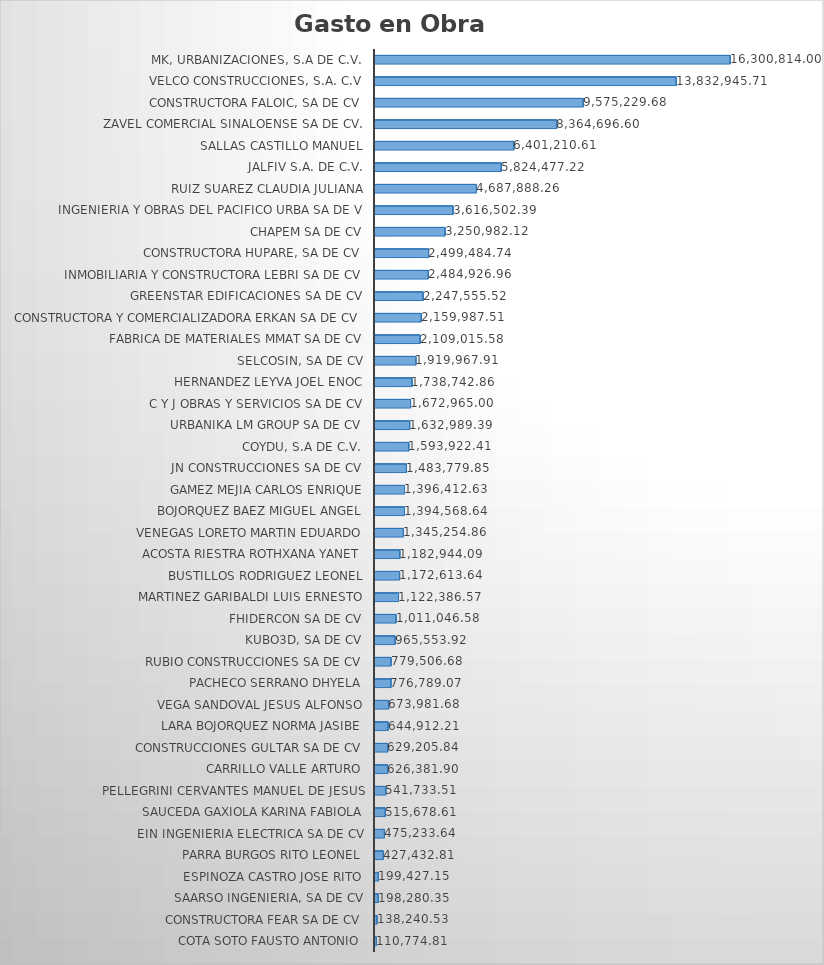
| Category | Suma |
|---|---|
| COTA SOTO FAUSTO ANTONIO | 110774.81 |
| CONSTRUCTORA FEAR SA DE CV | 138240.53 |
| SAARSO INGENIERIA, SA DE CV | 198280.35 |
| ESPINOZA CASTRO JOSE RITO | 199427.15 |
| PARRA BURGOS RITO LEONEL | 427432.81 |
| EIN INGENIERIA ELECTRICA SA DE CV | 475233.64 |
| SAUCEDA GAXIOLA KARINA FABIOLA | 515678.61 |
| PELLEGRINI CERVANTES MANUEL DE JESUS | 541733.51 |
| CARRILLO VALLE ARTURO | 626381.9 |
| CONSTRUCCIONES GULTAR SA DE CV | 629205.84 |
| LARA BOJORQUEZ NORMA JASIBE | 644912.21 |
| VEGA SANDOVAL JESUS ALFONSO | 673981.68 |
| PACHECO SERRANO DHYELA | 776789.07 |
| RUBIO CONSTRUCCIONES SA DE CV | 779506.68 |
| KUBO3D, SA DE CV | 965553.92 |
| FHIDERCON SA DE CV | 1011046.58 |
| MARTINEZ GARIBALDI LUIS ERNESTO | 1122386.57 |
| BUSTILLOS RODRIGUEZ LEONEL | 1172613.64 |
| ACOSTA RIESTRA ROTHXANA YANET | 1182944.09 |
| VENEGAS LORETO MARTIN EDUARDO | 1345254.86 |
| BOJORQUEZ BAEZ MIGUEL ANGEL | 1394568.64 |
| GAMEZ MEJIA CARLOS ENRIQUE | 1396412.63 |
| JN CONSTRUCCIONES SA DE CV | 1483779.85 |
| COYDU, S.A DE C.V. | 1593922.41 |
| URBANIKA LM GROUP SA DE CV | 1632989.39 |
| C Y J OBRAS Y SERVICIOS SA DE CV | 1672965 |
| HERNANDEZ LEYVA JOEL ENOC | 1738742.86 |
| SELCOSIN, SA DE CV | 1919967.91 |
| FABRICA DE MATERIALES MMAT SA DE CV | 2109015.58 |
| CONSTRUCTORA Y COMERCIALIZADORA ERKAN SA DE CV | 2159987.51 |
| GREENSTAR EDIFICACIONES SA DE CV | 2247555.52 |
| INMOBILIARIA Y CONSTRUCTORA LEBRI SA DE CV | 2484926.96 |
| CONSTRUCTORA HUPARE, SA DE CV | 2499484.74 |
| CHAPEM SA DE CV | 3250982.12 |
| INGENIERIA Y OBRAS DEL PACIFICO URBA SA DE V | 3616502.39 |
| RUIZ SUAREZ CLAUDIA JULIANA | 4687888.26 |
| JALFIV S.A. DE C.V. | 5824477.22 |
| SALLAS CASTILLO MANUEL | 6401210.61 |
| ZAVEL COMERCIAL SINALOENSE SA DE CV. | 8364696.6 |
| CONSTRUCTORA FALOIC, SA DE CV | 9575229.68 |
| VELCO CONSTRUCCIONES, S.A. C.V | 13832945.71 |
| MK, URBANIZACIONES, S.A DE C.V. | 16300814 |